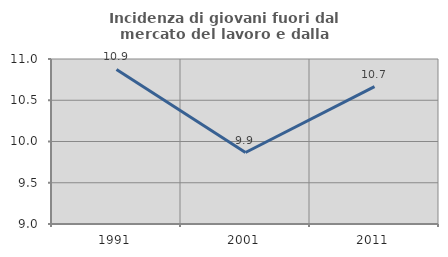
| Category | Incidenza di giovani fuori dal mercato del lavoro e dalla formazione  |
|---|---|
| 1991.0 | 10.873 |
| 2001.0 | 9.867 |
| 2011.0 | 10.664 |